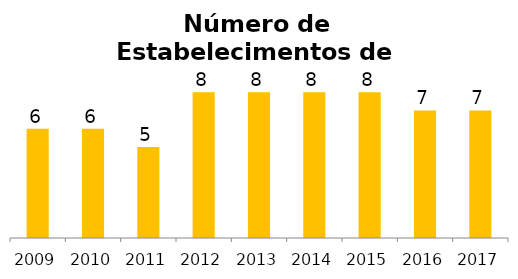
| Category | Aluguel de Transporte |
|---|---|
| 2009.0 | 6 |
| 2010.0 | 6 |
| 2011.0 | 5 |
| 2012.0 | 8 |
| 2013.0 | 8 |
| 2014.0 | 8 |
| 2015.0 | 8 |
| 2016.0 | 7 |
| 2017.0 | 7 |